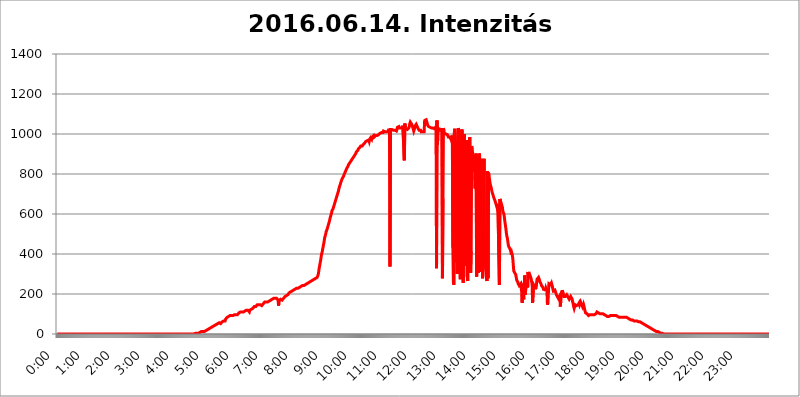
| Category | 2016.06.14. Intenzitás [W/m^2] |
|---|---|
| 0.0 | 0 |
| 0.0006944444444444445 | 0 |
| 0.001388888888888889 | 0 |
| 0.0020833333333333333 | 0 |
| 0.002777777777777778 | 0 |
| 0.003472222222222222 | 0 |
| 0.004166666666666667 | 0 |
| 0.004861111111111111 | 0 |
| 0.005555555555555556 | 0 |
| 0.0062499999999999995 | 0 |
| 0.006944444444444444 | 0 |
| 0.007638888888888889 | 0 |
| 0.008333333333333333 | 0 |
| 0.009027777777777779 | 0 |
| 0.009722222222222222 | 0 |
| 0.010416666666666666 | 0 |
| 0.011111111111111112 | 0 |
| 0.011805555555555555 | 0 |
| 0.012499999999999999 | 0 |
| 0.013194444444444444 | 0 |
| 0.013888888888888888 | 0 |
| 0.014583333333333332 | 0 |
| 0.015277777777777777 | 0 |
| 0.015972222222222224 | 0 |
| 0.016666666666666666 | 0 |
| 0.017361111111111112 | 0 |
| 0.018055555555555557 | 0 |
| 0.01875 | 0 |
| 0.019444444444444445 | 0 |
| 0.02013888888888889 | 0 |
| 0.020833333333333332 | 0 |
| 0.02152777777777778 | 0 |
| 0.022222222222222223 | 0 |
| 0.02291666666666667 | 0 |
| 0.02361111111111111 | 0 |
| 0.024305555555555556 | 0 |
| 0.024999999999999998 | 0 |
| 0.025694444444444447 | 0 |
| 0.02638888888888889 | 0 |
| 0.027083333333333334 | 0 |
| 0.027777777777777776 | 0 |
| 0.02847222222222222 | 0 |
| 0.029166666666666664 | 0 |
| 0.029861111111111113 | 0 |
| 0.030555555555555555 | 0 |
| 0.03125 | 0 |
| 0.03194444444444445 | 0 |
| 0.03263888888888889 | 0 |
| 0.03333333333333333 | 0 |
| 0.034027777777777775 | 0 |
| 0.034722222222222224 | 0 |
| 0.035416666666666666 | 0 |
| 0.036111111111111115 | 0 |
| 0.03680555555555556 | 0 |
| 0.0375 | 0 |
| 0.03819444444444444 | 0 |
| 0.03888888888888889 | 0 |
| 0.03958333333333333 | 0 |
| 0.04027777777777778 | 0 |
| 0.04097222222222222 | 0 |
| 0.041666666666666664 | 0 |
| 0.042361111111111106 | 0 |
| 0.04305555555555556 | 0 |
| 0.043750000000000004 | 0 |
| 0.044444444444444446 | 0 |
| 0.04513888888888889 | 0 |
| 0.04583333333333334 | 0 |
| 0.04652777777777778 | 0 |
| 0.04722222222222222 | 0 |
| 0.04791666666666666 | 0 |
| 0.04861111111111111 | 0 |
| 0.049305555555555554 | 0 |
| 0.049999999999999996 | 0 |
| 0.05069444444444445 | 0 |
| 0.051388888888888894 | 0 |
| 0.052083333333333336 | 0 |
| 0.05277777777777778 | 0 |
| 0.05347222222222222 | 0 |
| 0.05416666666666667 | 0 |
| 0.05486111111111111 | 0 |
| 0.05555555555555555 | 0 |
| 0.05625 | 0 |
| 0.05694444444444444 | 0 |
| 0.057638888888888885 | 0 |
| 0.05833333333333333 | 0 |
| 0.05902777777777778 | 0 |
| 0.059722222222222225 | 0 |
| 0.06041666666666667 | 0 |
| 0.061111111111111116 | 0 |
| 0.06180555555555556 | 0 |
| 0.0625 | 0 |
| 0.06319444444444444 | 0 |
| 0.06388888888888888 | 0 |
| 0.06458333333333334 | 0 |
| 0.06527777777777778 | 0 |
| 0.06597222222222222 | 0 |
| 0.06666666666666667 | 0 |
| 0.06736111111111111 | 0 |
| 0.06805555555555555 | 0 |
| 0.06874999999999999 | 0 |
| 0.06944444444444443 | 0 |
| 0.07013888888888889 | 0 |
| 0.07083333333333333 | 0 |
| 0.07152777777777779 | 0 |
| 0.07222222222222223 | 0 |
| 0.07291666666666667 | 0 |
| 0.07361111111111111 | 0 |
| 0.07430555555555556 | 0 |
| 0.075 | 0 |
| 0.07569444444444444 | 0 |
| 0.0763888888888889 | 0 |
| 0.07708333333333334 | 0 |
| 0.07777777777777778 | 0 |
| 0.07847222222222222 | 0 |
| 0.07916666666666666 | 0 |
| 0.0798611111111111 | 0 |
| 0.08055555555555556 | 0 |
| 0.08125 | 0 |
| 0.08194444444444444 | 0 |
| 0.08263888888888889 | 0 |
| 0.08333333333333333 | 0 |
| 0.08402777777777777 | 0 |
| 0.08472222222222221 | 0 |
| 0.08541666666666665 | 0 |
| 0.08611111111111112 | 0 |
| 0.08680555555555557 | 0 |
| 0.08750000000000001 | 0 |
| 0.08819444444444445 | 0 |
| 0.08888888888888889 | 0 |
| 0.08958333333333333 | 0 |
| 0.09027777777777778 | 0 |
| 0.09097222222222222 | 0 |
| 0.09166666666666667 | 0 |
| 0.09236111111111112 | 0 |
| 0.09305555555555556 | 0 |
| 0.09375 | 0 |
| 0.09444444444444444 | 0 |
| 0.09513888888888888 | 0 |
| 0.09583333333333333 | 0 |
| 0.09652777777777777 | 0 |
| 0.09722222222222222 | 0 |
| 0.09791666666666667 | 0 |
| 0.09861111111111111 | 0 |
| 0.09930555555555555 | 0 |
| 0.09999999999999999 | 0 |
| 0.10069444444444443 | 0 |
| 0.1013888888888889 | 0 |
| 0.10208333333333335 | 0 |
| 0.10277777777777779 | 0 |
| 0.10347222222222223 | 0 |
| 0.10416666666666667 | 0 |
| 0.10486111111111111 | 0 |
| 0.10555555555555556 | 0 |
| 0.10625 | 0 |
| 0.10694444444444444 | 0 |
| 0.1076388888888889 | 0 |
| 0.10833333333333334 | 0 |
| 0.10902777777777778 | 0 |
| 0.10972222222222222 | 0 |
| 0.1111111111111111 | 0 |
| 0.11180555555555556 | 0 |
| 0.11180555555555556 | 0 |
| 0.1125 | 0 |
| 0.11319444444444444 | 0 |
| 0.11388888888888889 | 0 |
| 0.11458333333333333 | 0 |
| 0.11527777777777777 | 0 |
| 0.11597222222222221 | 0 |
| 0.11666666666666665 | 0 |
| 0.1173611111111111 | 0 |
| 0.11805555555555557 | 0 |
| 0.11944444444444445 | 0 |
| 0.12013888888888889 | 0 |
| 0.12083333333333333 | 0 |
| 0.12152777777777778 | 0 |
| 0.12222222222222223 | 0 |
| 0.12291666666666667 | 0 |
| 0.12291666666666667 | 0 |
| 0.12361111111111112 | 0 |
| 0.12430555555555556 | 0 |
| 0.125 | 0 |
| 0.12569444444444444 | 0 |
| 0.12638888888888888 | 0 |
| 0.12708333333333333 | 0 |
| 0.16875 | 0 |
| 0.12847222222222224 | 0 |
| 0.12916666666666668 | 0 |
| 0.12986111111111112 | 0 |
| 0.13055555555555556 | 0 |
| 0.13125 | 0 |
| 0.13194444444444445 | 0 |
| 0.1326388888888889 | 0 |
| 0.13333333333333333 | 0 |
| 0.13402777777777777 | 0 |
| 0.13402777777777777 | 0 |
| 0.13472222222222222 | 0 |
| 0.13541666666666666 | 0 |
| 0.1361111111111111 | 0 |
| 0.13749999999999998 | 0 |
| 0.13819444444444443 | 0 |
| 0.1388888888888889 | 0 |
| 0.13958333333333334 | 0 |
| 0.14027777777777778 | 0 |
| 0.14097222222222222 | 0 |
| 0.14166666666666666 | 0 |
| 0.1423611111111111 | 0 |
| 0.14305555555555557 | 0 |
| 0.14375000000000002 | 0 |
| 0.14444444444444446 | 0 |
| 0.1451388888888889 | 0 |
| 0.1451388888888889 | 0 |
| 0.14652777777777778 | 0 |
| 0.14722222222222223 | 0 |
| 0.14791666666666667 | 0 |
| 0.1486111111111111 | 0 |
| 0.14930555555555555 | 0 |
| 0.15 | 0 |
| 0.15069444444444444 | 0 |
| 0.15138888888888888 | 0 |
| 0.15208333333333332 | 0 |
| 0.15277777777777776 | 0 |
| 0.15347222222222223 | 0 |
| 0.15416666666666667 | 0 |
| 0.15486111111111112 | 0 |
| 0.15555555555555556 | 0 |
| 0.15625 | 0 |
| 0.15694444444444444 | 0 |
| 0.15763888888888888 | 0 |
| 0.15833333333333333 | 0 |
| 0.15902777777777777 | 0 |
| 0.15972222222222224 | 0 |
| 0.16041666666666668 | 0 |
| 0.16111111111111112 | 0 |
| 0.16180555555555556 | 0 |
| 0.1625 | 0 |
| 0.16319444444444445 | 0 |
| 0.1638888888888889 | 0 |
| 0.16458333333333333 | 0 |
| 0.16527777777777777 | 0 |
| 0.16597222222222222 | 0 |
| 0.16666666666666666 | 0 |
| 0.1673611111111111 | 0 |
| 0.16805555555555554 | 0 |
| 0.16874999999999998 | 0 |
| 0.16944444444444443 | 0 |
| 0.17013888888888887 | 0 |
| 0.1708333333333333 | 0 |
| 0.17152777777777775 | 0 |
| 0.17222222222222225 | 0 |
| 0.1729166666666667 | 0 |
| 0.17361111111111113 | 0 |
| 0.17430555555555557 | 0 |
| 0.17500000000000002 | 0 |
| 0.17569444444444446 | 0 |
| 0.1763888888888889 | 0 |
| 0.17708333333333334 | 0 |
| 0.17777777777777778 | 0 |
| 0.17847222222222223 | 0 |
| 0.17916666666666667 | 0 |
| 0.1798611111111111 | 0 |
| 0.18055555555555555 | 0 |
| 0.18125 | 0 |
| 0.18194444444444444 | 0 |
| 0.1826388888888889 | 0 |
| 0.18333333333333335 | 0 |
| 0.1840277777777778 | 0 |
| 0.18472222222222223 | 0 |
| 0.18541666666666667 | 0 |
| 0.18611111111111112 | 0 |
| 0.18680555555555556 | 0 |
| 0.1875 | 0 |
| 0.18819444444444444 | 0 |
| 0.18888888888888888 | 0 |
| 0.18958333333333333 | 0 |
| 0.19027777777777777 | 0 |
| 0.1909722222222222 | 0 |
| 0.19166666666666665 | 0 |
| 0.19236111111111112 | 3.525 |
| 0.19305555555555554 | 3.525 |
| 0.19375 | 3.525 |
| 0.19444444444444445 | 3.525 |
| 0.1951388888888889 | 3.525 |
| 0.19583333333333333 | 3.525 |
| 0.19652777777777777 | 3.525 |
| 0.19722222222222222 | 3.525 |
| 0.19791666666666666 | 3.525 |
| 0.1986111111111111 | 7.887 |
| 0.19930555555555554 | 7.887 |
| 0.19999999999999998 | 7.887 |
| 0.20069444444444443 | 7.887 |
| 0.20138888888888887 | 7.887 |
| 0.2020833333333333 | 12.257 |
| 0.2027777777777778 | 12.257 |
| 0.2034722222222222 | 12.257 |
| 0.2041666666666667 | 12.257 |
| 0.20486111111111113 | 12.257 |
| 0.20555555555555557 | 12.257 |
| 0.20625000000000002 | 12.257 |
| 0.20694444444444446 | 16.636 |
| 0.2076388888888889 | 16.636 |
| 0.20833333333333334 | 16.636 |
| 0.20902777777777778 | 16.636 |
| 0.20972222222222223 | 21.024 |
| 0.21041666666666667 | 21.024 |
| 0.2111111111111111 | 21.024 |
| 0.21180555555555555 | 21.024 |
| 0.2125 | 25.419 |
| 0.21319444444444444 | 25.419 |
| 0.2138888888888889 | 25.419 |
| 0.21458333333333335 | 29.823 |
| 0.2152777777777778 | 29.823 |
| 0.21597222222222223 | 29.823 |
| 0.21666666666666667 | 34.234 |
| 0.21736111111111112 | 34.234 |
| 0.21805555555555556 | 38.653 |
| 0.21875 | 38.653 |
| 0.21944444444444444 | 38.653 |
| 0.22013888888888888 | 38.653 |
| 0.22083333333333333 | 43.079 |
| 0.22152777777777777 | 43.079 |
| 0.2222222222222222 | 47.511 |
| 0.22291666666666665 | 47.511 |
| 0.2236111111111111 | 47.511 |
| 0.22430555555555556 | 51.951 |
| 0.225 | 51.951 |
| 0.22569444444444445 | 51.951 |
| 0.2263888888888889 | 51.951 |
| 0.22708333333333333 | 56.398 |
| 0.22777777777777777 | 56.398 |
| 0.22847222222222222 | 51.951 |
| 0.22916666666666666 | 51.951 |
| 0.2298611111111111 | 51.951 |
| 0.23055555555555554 | 56.398 |
| 0.23124999999999998 | 60.85 |
| 0.23194444444444443 | 60.85 |
| 0.23263888888888887 | 60.85 |
| 0.2333333333333333 | 65.31 |
| 0.2340277777777778 | 65.31 |
| 0.2347222222222222 | 65.31 |
| 0.2354166666666667 | 65.31 |
| 0.23611111111111113 | 74.246 |
| 0.23680555555555557 | 74.246 |
| 0.23750000000000002 | 78.722 |
| 0.23819444444444446 | 83.205 |
| 0.2388888888888889 | 83.205 |
| 0.23958333333333334 | 83.205 |
| 0.24027777777777778 | 87.692 |
| 0.24097222222222223 | 87.692 |
| 0.24166666666666667 | 87.692 |
| 0.2423611111111111 | 92.184 |
| 0.24305555555555555 | 92.184 |
| 0.24375 | 92.184 |
| 0.24444444444444446 | 92.184 |
| 0.24513888888888888 | 96.682 |
| 0.24583333333333335 | 96.682 |
| 0.2465277777777778 | 92.184 |
| 0.24722222222222223 | 92.184 |
| 0.24791666666666667 | 96.682 |
| 0.24861111111111112 | 96.682 |
| 0.24930555555555556 | 101.184 |
| 0.25 | 101.184 |
| 0.25069444444444444 | 96.682 |
| 0.2513888888888889 | 92.184 |
| 0.2520833333333333 | 92.184 |
| 0.25277777777777777 | 96.682 |
| 0.2534722222222222 | 96.682 |
| 0.25416666666666665 | 101.184 |
| 0.2548611111111111 | 105.69 |
| 0.2555555555555556 | 110.201 |
| 0.25625000000000003 | 110.201 |
| 0.2569444444444445 | 110.201 |
| 0.2576388888888889 | 114.716 |
| 0.25833333333333336 | 110.201 |
| 0.2590277777777778 | 110.201 |
| 0.25972222222222224 | 110.201 |
| 0.2604166666666667 | 110.201 |
| 0.2611111111111111 | 110.201 |
| 0.26180555555555557 | 110.201 |
| 0.2625 | 114.716 |
| 0.26319444444444445 | 114.716 |
| 0.2638888888888889 | 114.716 |
| 0.26458333333333334 | 119.235 |
| 0.2652777777777778 | 119.235 |
| 0.2659722222222222 | 119.235 |
| 0.26666666666666666 | 123.758 |
| 0.2673611111111111 | 119.235 |
| 0.26805555555555555 | 119.235 |
| 0.26875 | 114.716 |
| 0.26944444444444443 | 110.201 |
| 0.2701388888888889 | 119.235 |
| 0.2708333333333333 | 123.758 |
| 0.27152777777777776 | 123.758 |
| 0.2722222222222222 | 123.758 |
| 0.27291666666666664 | 128.284 |
| 0.2736111111111111 | 123.758 |
| 0.2743055555555555 | 128.284 |
| 0.27499999999999997 | 132.814 |
| 0.27569444444444446 | 132.814 |
| 0.27638888888888885 | 137.347 |
| 0.27708333333333335 | 137.347 |
| 0.2777777777777778 | 137.347 |
| 0.27847222222222223 | 137.347 |
| 0.2791666666666667 | 141.884 |
| 0.2798611111111111 | 141.884 |
| 0.28055555555555556 | 146.423 |
| 0.28125 | 146.423 |
| 0.28194444444444444 | 146.423 |
| 0.2826388888888889 | 146.423 |
| 0.2833333333333333 | 146.423 |
| 0.28402777777777777 | 146.423 |
| 0.2847222222222222 | 146.423 |
| 0.28541666666666665 | 146.423 |
| 0.28611111111111115 | 146.423 |
| 0.28680555555555554 | 141.884 |
| 0.28750000000000003 | 146.423 |
| 0.2881944444444445 | 146.423 |
| 0.2888888888888889 | 150.964 |
| 0.28958333333333336 | 150.964 |
| 0.2902777777777778 | 155.509 |
| 0.29097222222222224 | 160.056 |
| 0.2916666666666667 | 155.509 |
| 0.2923611111111111 | 160.056 |
| 0.29305555555555557 | 160.056 |
| 0.29375 | 160.056 |
| 0.29444444444444445 | 160.056 |
| 0.2951388888888889 | 160.056 |
| 0.29583333333333334 | 164.605 |
| 0.2965277777777778 | 164.605 |
| 0.2972222222222222 | 164.605 |
| 0.29791666666666666 | 164.605 |
| 0.2986111111111111 | 169.156 |
| 0.29930555555555555 | 169.156 |
| 0.3 | 169.156 |
| 0.30069444444444443 | 173.709 |
| 0.3013888888888889 | 173.709 |
| 0.3020833333333333 | 173.709 |
| 0.30277777777777776 | 173.709 |
| 0.3034722222222222 | 178.264 |
| 0.30416666666666664 | 173.709 |
| 0.3048611111111111 | 178.264 |
| 0.3055555555555555 | 178.264 |
| 0.30624999999999997 | 178.264 |
| 0.3069444444444444 | 178.264 |
| 0.3076388888888889 | 178.264 |
| 0.30833333333333335 | 178.264 |
| 0.3090277777777778 | 173.709 |
| 0.30972222222222223 | 169.156 |
| 0.3104166666666667 | 141.884 |
| 0.3111111111111111 | 169.156 |
| 0.31180555555555556 | 169.156 |
| 0.3125 | 169.156 |
| 0.31319444444444444 | 173.709 |
| 0.3138888888888889 | 173.709 |
| 0.3145833333333333 | 169.156 |
| 0.31527777777777777 | 169.156 |
| 0.3159722222222222 | 173.709 |
| 0.31666666666666665 | 173.709 |
| 0.31736111111111115 | 178.264 |
| 0.31805555555555554 | 182.82 |
| 0.31875000000000003 | 182.82 |
| 0.3194444444444445 | 187.378 |
| 0.3201388888888889 | 187.378 |
| 0.32083333333333336 | 191.937 |
| 0.3215277777777778 | 191.937 |
| 0.32222222222222224 | 191.937 |
| 0.3229166666666667 | 196.497 |
| 0.3236111111111111 | 196.497 |
| 0.32430555555555557 | 201.058 |
| 0.325 | 205.62 |
| 0.32569444444444445 | 205.62 |
| 0.3263888888888889 | 210.182 |
| 0.32708333333333334 | 210.182 |
| 0.3277777777777778 | 210.182 |
| 0.3284722222222222 | 210.182 |
| 0.32916666666666666 | 214.746 |
| 0.3298611111111111 | 214.746 |
| 0.33055555555555555 | 214.746 |
| 0.33125 | 219.309 |
| 0.33194444444444443 | 219.309 |
| 0.3326388888888889 | 219.309 |
| 0.3333333333333333 | 223.873 |
| 0.3340277777777778 | 223.873 |
| 0.3347222222222222 | 223.873 |
| 0.3354166666666667 | 228.436 |
| 0.3361111111111111 | 228.436 |
| 0.3368055555555556 | 228.436 |
| 0.33749999999999997 | 228.436 |
| 0.33819444444444446 | 233 |
| 0.33888888888888885 | 233 |
| 0.33958333333333335 | 233 |
| 0.34027777777777773 | 233 |
| 0.34097222222222223 | 237.564 |
| 0.3416666666666666 | 237.564 |
| 0.3423611111111111 | 237.564 |
| 0.3430555555555555 | 242.127 |
| 0.34375 | 242.127 |
| 0.3444444444444445 | 242.127 |
| 0.3451388888888889 | 242.127 |
| 0.3458333333333334 | 242.127 |
| 0.34652777777777777 | 242.127 |
| 0.34722222222222227 | 246.689 |
| 0.34791666666666665 | 246.689 |
| 0.34861111111111115 | 251.251 |
| 0.34930555555555554 | 251.251 |
| 0.35000000000000003 | 251.251 |
| 0.3506944444444444 | 251.251 |
| 0.3513888888888889 | 251.251 |
| 0.3520833333333333 | 255.813 |
| 0.3527777777777778 | 255.813 |
| 0.3534722222222222 | 260.373 |
| 0.3541666666666667 | 260.373 |
| 0.3548611111111111 | 260.373 |
| 0.35555555555555557 | 260.373 |
| 0.35625 | 264.932 |
| 0.35694444444444445 | 264.932 |
| 0.3576388888888889 | 269.49 |
| 0.35833333333333334 | 269.49 |
| 0.3590277777777778 | 269.49 |
| 0.3597222222222222 | 269.49 |
| 0.36041666666666666 | 274.047 |
| 0.3611111111111111 | 274.047 |
| 0.36180555555555555 | 274.047 |
| 0.3625 | 278.603 |
| 0.36319444444444443 | 278.603 |
| 0.3638888888888889 | 278.603 |
| 0.3645833333333333 | 283.156 |
| 0.3652777777777778 | 287.709 |
| 0.3659722222222222 | 296.808 |
| 0.3666666666666667 | 310.44 |
| 0.3673611111111111 | 328.584 |
| 0.3680555555555556 | 342.162 |
| 0.36874999999999997 | 355.712 |
| 0.36944444444444446 | 369.23 |
| 0.37013888888888885 | 387.202 |
| 0.37083333333333335 | 400.638 |
| 0.37152777777777773 | 409.574 |
| 0.37222222222222223 | 422.943 |
| 0.3729166666666666 | 436.27 |
| 0.3736111111111111 | 449.551 |
| 0.3743055555555555 | 462.786 |
| 0.375 | 480.356 |
| 0.3756944444444445 | 489.108 |
| 0.3763888888888889 | 497.836 |
| 0.3770833333333334 | 510.885 |
| 0.37777777777777777 | 515.223 |
| 0.37847222222222227 | 523.88 |
| 0.37916666666666665 | 532.513 |
| 0.37986111111111115 | 541.121 |
| 0.38055555555555554 | 549.704 |
| 0.38125000000000003 | 558.261 |
| 0.3819444444444444 | 566.793 |
| 0.3826388888888889 | 579.542 |
| 0.3833333333333333 | 588.009 |
| 0.3840277777777778 | 596.45 |
| 0.3847222222222222 | 604.864 |
| 0.3854166666666667 | 617.436 |
| 0.3861111111111111 | 621.613 |
| 0.38680555555555557 | 625.784 |
| 0.3875 | 634.105 |
| 0.38819444444444445 | 642.4 |
| 0.3888888888888889 | 650.667 |
| 0.38958333333333334 | 658.909 |
| 0.3902777777777778 | 667.123 |
| 0.3909722222222222 | 675.311 |
| 0.39166666666666666 | 683.473 |
| 0.3923611111111111 | 691.608 |
| 0.39305555555555555 | 699.717 |
| 0.39375 | 707.8 |
| 0.39444444444444443 | 715.858 |
| 0.3951388888888889 | 727.896 |
| 0.3958333333333333 | 735.89 |
| 0.3965277777777778 | 743.859 |
| 0.3972222222222222 | 751.803 |
| 0.3979166666666667 | 759.723 |
| 0.3986111111111111 | 767.62 |
| 0.3993055555555556 | 771.559 |
| 0.39999999999999997 | 779.42 |
| 0.40069444444444446 | 783.342 |
| 0.40138888888888885 | 787.258 |
| 0.40208333333333335 | 795.074 |
| 0.40277777777777773 | 798.974 |
| 0.40347222222222223 | 806.757 |
| 0.4041666666666666 | 810.641 |
| 0.4048611111111111 | 818.392 |
| 0.4055555555555555 | 822.26 |
| 0.40625 | 829.981 |
| 0.4069444444444445 | 833.834 |
| 0.4076388888888889 | 837.682 |
| 0.4083333333333334 | 845.365 |
| 0.40902777777777777 | 845.365 |
| 0.40972222222222227 | 853.029 |
| 0.41041666666666665 | 856.855 |
| 0.41111111111111115 | 860.676 |
| 0.41180555555555554 | 860.676 |
| 0.41250000000000003 | 868.305 |
| 0.4131944444444444 | 868.305 |
| 0.4138888888888889 | 872.114 |
| 0.4145833333333333 | 879.719 |
| 0.4152777777777778 | 883.516 |
| 0.4159722222222222 | 887.309 |
| 0.4166666666666667 | 887.309 |
| 0.4173611111111111 | 894.885 |
| 0.41805555555555557 | 898.668 |
| 0.41875 | 902.447 |
| 0.41944444444444445 | 909.996 |
| 0.4201388888888889 | 909.996 |
| 0.42083333333333334 | 913.766 |
| 0.4215277777777778 | 917.534 |
| 0.4222222222222222 | 925.06 |
| 0.42291666666666666 | 925.06 |
| 0.4236111111111111 | 928.819 |
| 0.42430555555555555 | 932.576 |
| 0.425 | 936.33 |
| 0.42569444444444443 | 940.082 |
| 0.4263888888888889 | 936.33 |
| 0.4270833333333333 | 943.832 |
| 0.4277777777777778 | 940.082 |
| 0.4284722222222222 | 940.082 |
| 0.4291666666666667 | 947.58 |
| 0.4298611111111111 | 947.58 |
| 0.4305555555555556 | 951.327 |
| 0.43124999999999997 | 955.071 |
| 0.43194444444444446 | 958.814 |
| 0.43263888888888885 | 962.555 |
| 0.43333333333333335 | 962.555 |
| 0.43402777777777773 | 958.814 |
| 0.43472222222222223 | 966.295 |
| 0.4354166666666666 | 962.555 |
| 0.4361111111111111 | 962.555 |
| 0.4368055555555555 | 970.034 |
| 0.4375 | 962.555 |
| 0.4381944444444445 | 973.772 |
| 0.4388888888888889 | 970.034 |
| 0.4395833333333334 | 981.244 |
| 0.44027777777777777 | 984.98 |
| 0.44097222222222227 | 973.772 |
| 0.44166666666666665 | 984.98 |
| 0.44236111111111115 | 988.714 |
| 0.44305555555555554 | 984.98 |
| 0.44375000000000003 | 992.448 |
| 0.4444444444444444 | 984.98 |
| 0.4451388888888889 | 984.98 |
| 0.4458333333333333 | 984.98 |
| 0.4465277777777778 | 992.448 |
| 0.4472222222222222 | 996.182 |
| 0.4479166666666667 | 992.448 |
| 0.4486111111111111 | 992.448 |
| 0.44930555555555557 | 996.182 |
| 0.45 | 996.182 |
| 0.45069444444444445 | 996.182 |
| 0.4513888888888889 | 999.916 |
| 0.45208333333333334 | 999.916 |
| 0.4527777777777778 | 1003.65 |
| 0.4534722222222222 | 1003.65 |
| 0.45416666666666666 | 1007.383 |
| 0.4548611111111111 | 1007.383 |
| 0.45555555555555555 | 1011.118 |
| 0.45625 | 1011.118 |
| 0.45694444444444443 | 1007.383 |
| 0.4576388888888889 | 1014.852 |
| 0.4583333333333333 | 1014.852 |
| 0.4590277777777778 | 1014.852 |
| 0.4597222222222222 | 1011.118 |
| 0.4604166666666667 | 1011.118 |
| 0.4611111111111111 | 1011.118 |
| 0.4618055555555556 | 1011.118 |
| 0.46249999999999997 | 1011.118 |
| 0.46319444444444446 | 1007.383 |
| 0.46388888888888885 | 1011.118 |
| 0.46458333333333335 | 1014.852 |
| 0.46527777777777773 | 1026.06 |
| 0.46597222222222223 | 1003.65 |
| 0.4666666666666666 | 337.639 |
| 0.4673611111111111 | 1022.323 |
| 0.4680555555555555 | 1022.323 |
| 0.46875 | 1022.323 |
| 0.4694444444444445 | 1022.323 |
| 0.4701388888888889 | 1018.587 |
| 0.4708333333333334 | 1018.587 |
| 0.47152777777777777 | 1018.587 |
| 0.47222222222222227 | 1018.587 |
| 0.47291666666666665 | 1014.852 |
| 0.47361111111111115 | 1018.587 |
| 0.47430555555555554 | 1022.323 |
| 0.47500000000000003 | 1022.323 |
| 0.4756944444444444 | 1014.852 |
| 0.4763888888888889 | 1022.323 |
| 0.4770833333333333 | 1033.537 |
| 0.4777777777777778 | 1037.277 |
| 0.4784722222222222 | 1037.277 |
| 0.4791666666666667 | 1037.277 |
| 0.4798611111111111 | 1029.798 |
| 0.48055555555555557 | 1029.798 |
| 0.48125 | 1033.537 |
| 0.48194444444444445 | 1029.798 |
| 0.4826388888888889 | 1029.798 |
| 0.48333333333333334 | 1033.537 |
| 0.4840277777777778 | 1033.537 |
| 0.4847222222222222 | 1041.019 |
| 0.48541666666666666 | 1041.019 |
| 0.4861111111111111 | 1041.019 |
| 0.48680555555555555 | 868.305 |
| 0.4875 | 1052.255 |
| 0.48819444444444443 | 1033.537 |
| 0.4888888888888889 | 1026.06 |
| 0.4895833333333333 | 1026.06 |
| 0.4902777777777778 | 1026.06 |
| 0.4909722222222222 | 1022.323 |
| 0.4916666666666667 | 1022.323 |
| 0.4923611111111111 | 1022.323 |
| 0.4930555555555556 | 1029.798 |
| 0.49374999999999997 | 1037.277 |
| 0.49444444444444446 | 1052.255 |
| 0.49513888888888885 | 1059.756 |
| 0.49583333333333335 | 1056.004 |
| 0.49652777777777773 | 1056.004 |
| 0.49722222222222223 | 1048.508 |
| 0.4979166666666666 | 1041.019 |
| 0.4986111111111111 | 1033.537 |
| 0.4993055555555555 | 1029.798 |
| 0.5 | 1014.852 |
| 0.5006944444444444 | 1022.323 |
| 0.5013888888888889 | 1026.06 |
| 0.5020833333333333 | 1041.019 |
| 0.5027777777777778 | 1041.019 |
| 0.5034722222222222 | 1048.508 |
| 0.5041666666666667 | 1044.762 |
| 0.5048611111111111 | 1037.277 |
| 0.5055555555555555 | 1037.277 |
| 0.50625 | 1026.06 |
| 0.5069444444444444 | 1026.06 |
| 0.5076388888888889 | 1018.587 |
| 0.5083333333333333 | 1022.323 |
| 0.5090277777777777 | 1018.587 |
| 0.5097222222222222 | 1018.587 |
| 0.5104166666666666 | 1011.118 |
| 0.5111111111111112 | 1014.852 |
| 0.5118055555555555 | 1014.852 |
| 0.5125000000000001 | 1011.118 |
| 0.5131944444444444 | 1011.118 |
| 0.513888888888889 | 1011.118 |
| 0.5145833333333333 | 1011.118 |
| 0.5152777777777778 | 1067.267 |
| 0.5159722222222222 | 1067.267 |
| 0.5166666666666667 | 1063.51 |
| 0.517361111111111 | 1071.027 |
| 0.5180555555555556 | 1067.267 |
| 0.5187499999999999 | 1056.004 |
| 0.5194444444444445 | 1044.762 |
| 0.5201388888888888 | 1041.019 |
| 0.5208333333333334 | 1037.277 |
| 0.5215277777777778 | 1033.537 |
| 0.5222222222222223 | 1033.537 |
| 0.5229166666666667 | 1033.537 |
| 0.5236111111111111 | 1029.798 |
| 0.5243055555555556 | 1033.537 |
| 0.525 | 1029.798 |
| 0.5256944444444445 | 1026.06 |
| 0.5263888888888889 | 1026.06 |
| 0.5270833333333333 | 1029.798 |
| 0.5277777777777778 | 1026.06 |
| 0.5284722222222222 | 1026.06 |
| 0.5291666666666667 | 1026.06 |
| 0.5298611111111111 | 1026.06 |
| 0.5305555555555556 | 1022.323 |
| 0.53125 | 1037.277 |
| 0.5319444444444444 | 328.584 |
| 0.5326388888888889 | 1067.267 |
| 0.5333333333333333 | 947.58 |
| 0.5340277777777778 | 1029.798 |
| 0.5347222222222222 | 1029.798 |
| 0.5354166666666667 | 1026.06 |
| 0.5361111111111111 | 1022.323 |
| 0.5368055555555555 | 1018.587 |
| 0.5375 | 1018.587 |
| 0.5381944444444444 | 1018.587 |
| 0.5388888888888889 | 1022.323 |
| 0.5395833333333333 | 1029.798 |
| 0.5402777777777777 | 278.603 |
| 0.5409722222222222 | 679.395 |
| 0.5416666666666666 | 1029.798 |
| 0.5423611111111112 | 1014.852 |
| 0.5430555555555555 | 1003.65 |
| 0.5437500000000001 | 1003.65 |
| 0.5444444444444444 | 999.916 |
| 0.545138888888889 | 999.916 |
| 0.5458333333333333 | 999.916 |
| 0.5465277777777778 | 996.182 |
| 0.5472222222222222 | 996.182 |
| 0.5479166666666667 | 992.448 |
| 0.548611111111111 | 984.98 |
| 0.5493055555555556 | 984.98 |
| 0.5499999999999999 | 984.98 |
| 0.5506944444444445 | 984.98 |
| 0.5513888888888888 | 981.244 |
| 0.5520833333333334 | 973.772 |
| 0.5527777777777778 | 977.508 |
| 0.5534722222222223 | 973.772 |
| 0.5541666666666667 | 992.448 |
| 0.5548611111111111 | 431.833 |
| 0.5555555555555556 | 260.373 |
| 0.55625 | 246.689 |
| 0.5569444444444445 | 1007.383 |
| 0.5576388888888889 | 1026.06 |
| 0.5583333333333333 | 962.555 |
| 0.5590277777777778 | 940.082 |
| 0.5597222222222222 | 360.221 |
| 0.5604166666666667 | 440.702 |
| 0.5611111111111111 | 301.354 |
| 0.5618055555555556 | 301.354 |
| 0.5625 | 1029.798 |
| 0.5631944444444444 | 1011.118 |
| 0.5638888888888889 | 988.714 |
| 0.5645833333333333 | 992.448 |
| 0.5652777777777778 | 274.047 |
| 0.5659722222222222 | 868.305 |
| 0.5666666666666667 | 342.162 |
| 0.5673611111111111 | 1022.323 |
| 0.5680555555555555 | 1007.383 |
| 0.56875 | 287.709 |
| 0.5694444444444444 | 255.813 |
| 0.5701388888888889 | 255.813 |
| 0.5708333333333333 | 999.916 |
| 0.5715277777777777 | 342.162 |
| 0.5722222222222222 | 378.224 |
| 0.5729166666666666 | 822.26 |
| 0.5736111111111112 | 833.834 |
| 0.5743055555555555 | 970.034 |
| 0.5750000000000001 | 287.709 |
| 0.5756944444444444 | 264.932 |
| 0.576388888888889 | 951.327 |
| 0.5770833333333333 | 571.049 |
| 0.5777777777777778 | 382.715 |
| 0.5784722222222222 | 984.98 |
| 0.5791666666666667 | 333.113 |
| 0.579861111111111 | 305.898 |
| 0.5805555555555556 | 414.035 |
| 0.5812499999999999 | 940.082 |
| 0.5819444444444445 | 917.534 |
| 0.5826388888888888 | 906.223 |
| 0.5833333333333334 | 898.668 |
| 0.5840277777777778 | 891.099 |
| 0.5847222222222223 | 883.516 |
| 0.5854166666666667 | 883.516 |
| 0.5861111111111111 | 727.896 |
| 0.5868055555555556 | 868.305 |
| 0.5875 | 902.447 |
| 0.5881944444444445 | 287.709 |
| 0.5888888888888889 | 883.516 |
| 0.5895833333333333 | 887.309 |
| 0.5902777777777778 | 305.898 |
| 0.5909722222222222 | 360.221 |
| 0.5916666666666667 | 902.447 |
| 0.5923611111111111 | 894.885 |
| 0.5930555555555556 | 310.44 |
| 0.59375 | 364.728 |
| 0.5944444444444444 | 875.918 |
| 0.5951388888888889 | 369.23 |
| 0.5958333333333333 | 471.582 |
| 0.5965277777777778 | 278.603 |
| 0.5972222222222222 | 342.162 |
| 0.5979166666666667 | 532.513 |
| 0.5986111111111111 | 875.918 |
| 0.5993055555555555 | 387.202 |
| 0.6 | 333.113 |
| 0.6006944444444444 | 378.224 |
| 0.6013888888888889 | 319.517 |
| 0.6020833333333333 | 278.603 |
| 0.6027777777777777 | 264.932 |
| 0.6034722222222222 | 814.519 |
| 0.6041666666666666 | 278.603 |
| 0.6048611111111112 | 806.757 |
| 0.6055555555555555 | 791.169 |
| 0.6062500000000001 | 775.492 |
| 0.6069444444444444 | 755.766 |
| 0.607638888888889 | 743.859 |
| 0.6083333333333333 | 735.89 |
| 0.6090277777777778 | 723.889 |
| 0.6097222222222222 | 711.832 |
| 0.6104166666666667 | 703.762 |
| 0.611111111111111 | 695.666 |
| 0.6118055555555556 | 687.544 |
| 0.6124999999999999 | 679.395 |
| 0.6131944444444445 | 675.311 |
| 0.6138888888888888 | 667.123 |
| 0.6145833333333334 | 658.909 |
| 0.6152777777777778 | 650.667 |
| 0.6159722222222223 | 642.4 |
| 0.6166666666666667 | 634.105 |
| 0.6173611111111111 | 642.4 |
| 0.6180555555555556 | 650.667 |
| 0.61875 | 654.791 |
| 0.6194444444444445 | 650.667 |
| 0.6201388888888889 | 246.689 |
| 0.6208333333333333 | 675.311 |
| 0.6215277777777778 | 667.123 |
| 0.6222222222222222 | 658.909 |
| 0.6229166666666667 | 650.667 |
| 0.6236111111111111 | 646.537 |
| 0.6243055555555556 | 634.105 |
| 0.625 | 613.252 |
| 0.6256944444444444 | 609.062 |
| 0.6263888888888889 | 600.661 |
| 0.6270833333333333 | 583.779 |
| 0.6277777777777778 | 562.53 |
| 0.6284722222222222 | 545.416 |
| 0.6291666666666667 | 528.2 |
| 0.6298611111111111 | 506.542 |
| 0.6305555555555555 | 489.108 |
| 0.63125 | 480.356 |
| 0.6319444444444444 | 462.786 |
| 0.6326388888888889 | 445.129 |
| 0.6333333333333333 | 436.27 |
| 0.6340277777777777 | 431.833 |
| 0.6347222222222222 | 427.39 |
| 0.6354166666666666 | 422.943 |
| 0.6361111111111112 | 414.035 |
| 0.6368055555555555 | 396.164 |
| 0.6375000000000001 | 405.108 |
| 0.6381944444444444 | 396.164 |
| 0.638888888888889 | 378.224 |
| 0.6395833333333333 | 346.682 |
| 0.6402777777777778 | 314.98 |
| 0.6409722222222222 | 310.44 |
| 0.6416666666666667 | 305.898 |
| 0.642361111111111 | 305.898 |
| 0.6430555555555556 | 296.808 |
| 0.6437499999999999 | 283.156 |
| 0.6444444444444445 | 269.49 |
| 0.6451388888888888 | 264.932 |
| 0.6458333333333334 | 260.373 |
| 0.6465277777777778 | 251.251 |
| 0.6472222222222223 | 246.689 |
| 0.6479166666666667 | 242.127 |
| 0.6486111111111111 | 246.689 |
| 0.6493055555555556 | 246.689 |
| 0.65 | 251.251 |
| 0.6506944444444445 | 255.813 |
| 0.6513888888888889 | 210.182 |
| 0.6520833333333333 | 155.509 |
| 0.6527777777777778 | 251.251 |
| 0.6534722222222222 | 251.251 |
| 0.6541666666666667 | 173.709 |
| 0.6548611111111111 | 173.709 |
| 0.6555555555555556 | 292.259 |
| 0.65625 | 196.497 |
| 0.6569444444444444 | 219.309 |
| 0.6576388888888889 | 233 |
| 0.6583333333333333 | 237.564 |
| 0.6590277777777778 | 242.127 |
| 0.6597222222222222 | 233 |
| 0.6604166666666667 | 310.44 |
| 0.6611111111111111 | 296.808 |
| 0.6618055555555555 | 278.603 |
| 0.6625 | 283.156 |
| 0.6631944444444444 | 292.259 |
| 0.6638888888888889 | 287.709 |
| 0.6645833333333333 | 278.603 |
| 0.6652777777777777 | 260.373 |
| 0.6659722222222222 | 251.251 |
| 0.6666666666666666 | 155.509 |
| 0.6673611111111111 | 155.509 |
| 0.6680555555555556 | 246.689 |
| 0.6687500000000001 | 251.251 |
| 0.6694444444444444 | 246.689 |
| 0.6701388888888888 | 233 |
| 0.6708333333333334 | 223.873 |
| 0.6715277777777778 | 228.436 |
| 0.6722222222222222 | 251.251 |
| 0.6729166666666666 | 274.047 |
| 0.6736111111111112 | 278.603 |
| 0.6743055555555556 | 278.603 |
| 0.6749999999999999 | 283.156 |
| 0.6756944444444444 | 278.603 |
| 0.6763888888888889 | 269.49 |
| 0.6770833333333334 | 260.373 |
| 0.6777777777777777 | 255.813 |
| 0.6784722222222223 | 251.251 |
| 0.6791666666666667 | 242.127 |
| 0.6798611111111111 | 237.564 |
| 0.6805555555555555 | 237.564 |
| 0.68125 | 233 |
| 0.6819444444444445 | 223.873 |
| 0.6826388888888889 | 223.873 |
| 0.6833333333333332 | 223.873 |
| 0.6840277777777778 | 223.873 |
| 0.6847222222222222 | 214.746 |
| 0.6854166666666667 | 228.436 |
| 0.686111111111111 | 228.436 |
| 0.6868055555555556 | 214.746 |
| 0.6875 | 146.423 |
| 0.6881944444444444 | 155.509 |
| 0.688888888888889 | 210.182 |
| 0.6895833333333333 | 251.251 |
| 0.6902777777777778 | 251.251 |
| 0.6909722222222222 | 246.689 |
| 0.6916666666666668 | 246.689 |
| 0.6923611111111111 | 251.251 |
| 0.6930555555555555 | 255.813 |
| 0.69375 | 246.689 |
| 0.6944444444444445 | 237.564 |
| 0.6951388888888889 | 223.873 |
| 0.6958333333333333 | 214.746 |
| 0.6965277777777777 | 210.182 |
| 0.6972222222222223 | 210.182 |
| 0.6979166666666666 | 219.309 |
| 0.6986111111111111 | 214.746 |
| 0.6993055555555556 | 205.62 |
| 0.7000000000000001 | 196.497 |
| 0.7006944444444444 | 191.937 |
| 0.7013888888888888 | 187.378 |
| 0.7020833333333334 | 182.82 |
| 0.7027777777777778 | 178.264 |
| 0.7034722222222222 | 173.709 |
| 0.7041666666666666 | 182.82 |
| 0.7048611111111112 | 191.937 |
| 0.7055555555555556 | 137.347 |
| 0.7062499999999999 | 164.605 |
| 0.7069444444444444 | 196.497 |
| 0.7076388888888889 | 205.62 |
| 0.7083333333333334 | 219.309 |
| 0.7090277777777777 | 223.873 |
| 0.7097222222222223 | 219.309 |
| 0.7104166666666667 | 187.378 |
| 0.7111111111111111 | 191.937 |
| 0.7118055555555555 | 187.378 |
| 0.7125 | 187.378 |
| 0.7131944444444445 | 187.378 |
| 0.7138888888888889 | 191.937 |
| 0.7145833333333332 | 196.497 |
| 0.7152777777777778 | 196.497 |
| 0.7159722222222222 | 191.937 |
| 0.7166666666666667 | 182.82 |
| 0.717361111111111 | 182.82 |
| 0.7180555555555556 | 173.709 |
| 0.71875 | 173.709 |
| 0.7194444444444444 | 178.264 |
| 0.720138888888889 | 187.378 |
| 0.7208333333333333 | 187.378 |
| 0.7215277777777778 | 182.82 |
| 0.7222222222222222 | 173.709 |
| 0.7229166666666668 | 160.056 |
| 0.7236111111111111 | 150.964 |
| 0.7243055555555555 | 137.347 |
| 0.725 | 128.284 |
| 0.7256944444444445 | 128.284 |
| 0.7263888888888889 | 146.423 |
| 0.7270833333333333 | 141.884 |
| 0.7277777777777777 | 146.423 |
| 0.7284722222222223 | 141.884 |
| 0.7291666666666666 | 146.423 |
| 0.7298611111111111 | 141.884 |
| 0.7305555555555556 | 146.423 |
| 0.7312500000000001 | 150.964 |
| 0.7319444444444444 | 155.509 |
| 0.7326388888888888 | 146.423 |
| 0.7333333333333334 | 150.964 |
| 0.7340277777777778 | 160.056 |
| 0.7347222222222222 | 160.056 |
| 0.7354166666666666 | 155.509 |
| 0.7361111111111112 | 141.884 |
| 0.7368055555555556 | 155.509 |
| 0.7374999999999999 | 137.347 |
| 0.7381944444444444 | 146.423 |
| 0.7388888888888889 | 137.347 |
| 0.7395833333333334 | 123.758 |
| 0.7402777777777777 | 114.716 |
| 0.7409722222222223 | 105.69 |
| 0.7416666666666667 | 110.201 |
| 0.7423611111111111 | 110.201 |
| 0.7430555555555555 | 101.184 |
| 0.74375 | 96.682 |
| 0.7444444444444445 | 96.682 |
| 0.7451388888888889 | 92.184 |
| 0.7458333333333332 | 92.184 |
| 0.7465277777777778 | 92.184 |
| 0.7472222222222222 | 96.682 |
| 0.7479166666666667 | 96.682 |
| 0.748611111111111 | 96.682 |
| 0.7493055555555556 | 96.682 |
| 0.75 | 96.682 |
| 0.7506944444444444 | 92.184 |
| 0.751388888888889 | 96.682 |
| 0.7520833333333333 | 96.682 |
| 0.7527777777777778 | 96.682 |
| 0.7534722222222222 | 96.682 |
| 0.7541666666666668 | 96.682 |
| 0.7548611111111111 | 96.682 |
| 0.7555555555555555 | 101.184 |
| 0.75625 | 105.69 |
| 0.7569444444444445 | 110.201 |
| 0.7576388888888889 | 105.69 |
| 0.7583333333333333 | 105.69 |
| 0.7590277777777777 | 105.69 |
| 0.7597222222222223 | 101.184 |
| 0.7604166666666666 | 101.184 |
| 0.7611111111111111 | 101.184 |
| 0.7618055555555556 | 96.682 |
| 0.7625000000000001 | 101.184 |
| 0.7631944444444444 | 101.184 |
| 0.7638888888888888 | 96.682 |
| 0.7645833333333334 | 96.682 |
| 0.7652777777777778 | 101.184 |
| 0.7659722222222222 | 96.682 |
| 0.7666666666666666 | 96.682 |
| 0.7673611111111112 | 96.682 |
| 0.7680555555555556 | 92.184 |
| 0.7687499999999999 | 92.184 |
| 0.7694444444444444 | 92.184 |
| 0.7701388888888889 | 92.184 |
| 0.7708333333333334 | 87.692 |
| 0.7715277777777777 | 87.692 |
| 0.7722222222222223 | 87.692 |
| 0.7729166666666667 | 87.692 |
| 0.7736111111111111 | 87.692 |
| 0.7743055555555555 | 92.184 |
| 0.775 | 92.184 |
| 0.7756944444444445 | 92.184 |
| 0.7763888888888889 | 92.184 |
| 0.7770833333333332 | 92.184 |
| 0.7777777777777778 | 92.184 |
| 0.7784722222222222 | 92.184 |
| 0.7791666666666667 | 92.184 |
| 0.779861111111111 | 92.184 |
| 0.7805555555555556 | 92.184 |
| 0.78125 | 92.184 |
| 0.7819444444444444 | 92.184 |
| 0.782638888888889 | 92.184 |
| 0.7833333333333333 | 92.184 |
| 0.7840277777777778 | 92.184 |
| 0.7847222222222222 | 87.692 |
| 0.7854166666666668 | 87.692 |
| 0.7861111111111111 | 87.692 |
| 0.7868055555555555 | 83.205 |
| 0.7875 | 83.205 |
| 0.7881944444444445 | 83.205 |
| 0.7888888888888889 | 83.205 |
| 0.7895833333333333 | 83.205 |
| 0.7902777777777777 | 83.205 |
| 0.7909722222222223 | 83.205 |
| 0.7916666666666666 | 83.205 |
| 0.7923611111111111 | 83.205 |
| 0.7930555555555556 | 83.205 |
| 0.7937500000000001 | 83.205 |
| 0.7944444444444444 | 83.205 |
| 0.7951388888888888 | 83.205 |
| 0.7958333333333334 | 83.205 |
| 0.7965277777777778 | 83.205 |
| 0.7972222222222222 | 83.205 |
| 0.7979166666666666 | 83.205 |
| 0.7986111111111112 | 83.205 |
| 0.7993055555555556 | 78.722 |
| 0.7999999999999999 | 78.722 |
| 0.8006944444444444 | 78.722 |
| 0.8013888888888889 | 78.722 |
| 0.8020833333333334 | 74.246 |
| 0.8027777777777777 | 74.246 |
| 0.8034722222222223 | 74.246 |
| 0.8041666666666667 | 74.246 |
| 0.8048611111111111 | 69.775 |
| 0.8055555555555555 | 69.775 |
| 0.80625 | 69.775 |
| 0.8069444444444445 | 69.775 |
| 0.8076388888888889 | 69.775 |
| 0.8083333333333332 | 65.31 |
| 0.8090277777777778 | 65.31 |
| 0.8097222222222222 | 65.31 |
| 0.8104166666666667 | 65.31 |
| 0.811111111111111 | 65.31 |
| 0.8118055555555556 | 65.31 |
| 0.8125 | 65.31 |
| 0.8131944444444444 | 65.31 |
| 0.813888888888889 | 65.31 |
| 0.8145833333333333 | 60.85 |
| 0.8152777777777778 | 60.85 |
| 0.8159722222222222 | 60.85 |
| 0.8166666666666668 | 60.85 |
| 0.8173611111111111 | 60.85 |
| 0.8180555555555555 | 56.398 |
| 0.81875 | 56.398 |
| 0.8194444444444445 | 56.398 |
| 0.8201388888888889 | 56.398 |
| 0.8208333333333333 | 51.951 |
| 0.8215277777777777 | 51.951 |
| 0.8222222222222223 | 51.951 |
| 0.8229166666666666 | 47.511 |
| 0.8236111111111111 | 47.511 |
| 0.8243055555555556 | 47.511 |
| 0.8250000000000001 | 43.079 |
| 0.8256944444444444 | 43.079 |
| 0.8263888888888888 | 38.653 |
| 0.8270833333333334 | 38.653 |
| 0.8277777777777778 | 38.653 |
| 0.8284722222222222 | 38.653 |
| 0.8291666666666666 | 34.234 |
| 0.8298611111111112 | 34.234 |
| 0.8305555555555556 | 29.823 |
| 0.8312499999999999 | 29.823 |
| 0.8319444444444444 | 29.823 |
| 0.8326388888888889 | 25.419 |
| 0.8333333333333334 | 25.419 |
| 0.8340277777777777 | 25.419 |
| 0.8347222222222223 | 25.419 |
| 0.8354166666666667 | 21.024 |
| 0.8361111111111111 | 21.024 |
| 0.8368055555555555 | 21.024 |
| 0.8375 | 16.636 |
| 0.8381944444444445 | 16.636 |
| 0.8388888888888889 | 16.636 |
| 0.8395833333333332 | 16.636 |
| 0.8402777777777778 | 12.257 |
| 0.8409722222222222 | 12.257 |
| 0.8416666666666667 | 12.257 |
| 0.842361111111111 | 12.257 |
| 0.8430555555555556 | 12.257 |
| 0.84375 | 7.887 |
| 0.8444444444444444 | 7.887 |
| 0.845138888888889 | 7.887 |
| 0.8458333333333333 | 7.887 |
| 0.8465277777777778 | 3.525 |
| 0.8472222222222222 | 3.525 |
| 0.8479166666666668 | 3.525 |
| 0.8486111111111111 | 3.525 |
| 0.8493055555555555 | 3.525 |
| 0.85 | 0 |
| 0.8506944444444445 | 0 |
| 0.8513888888888889 | 0 |
| 0.8520833333333333 | 0 |
| 0.8527777777777777 | 0 |
| 0.8534722222222223 | 0 |
| 0.8541666666666666 | 0 |
| 0.8548611111111111 | 0 |
| 0.8555555555555556 | 0 |
| 0.8562500000000001 | 0 |
| 0.8569444444444444 | 0 |
| 0.8576388888888888 | 0 |
| 0.8583333333333334 | 0 |
| 0.8590277777777778 | 0 |
| 0.8597222222222222 | 0 |
| 0.8604166666666666 | 0 |
| 0.8611111111111112 | 0 |
| 0.8618055555555556 | 0 |
| 0.8624999999999999 | 0 |
| 0.8631944444444444 | 0 |
| 0.8638888888888889 | 0 |
| 0.8645833333333334 | 0 |
| 0.8652777777777777 | 0 |
| 0.8659722222222223 | 0 |
| 0.8666666666666667 | 0 |
| 0.8673611111111111 | 0 |
| 0.8680555555555555 | 0 |
| 0.86875 | 0 |
| 0.8694444444444445 | 0 |
| 0.8701388888888889 | 0 |
| 0.8708333333333332 | 0 |
| 0.8715277777777778 | 0 |
| 0.8722222222222222 | 0 |
| 0.8729166666666667 | 0 |
| 0.873611111111111 | 0 |
| 0.8743055555555556 | 0 |
| 0.875 | 0 |
| 0.8756944444444444 | 0 |
| 0.876388888888889 | 0 |
| 0.8770833333333333 | 0 |
| 0.8777777777777778 | 0 |
| 0.8784722222222222 | 0 |
| 0.8791666666666668 | 0 |
| 0.8798611111111111 | 0 |
| 0.8805555555555555 | 0 |
| 0.88125 | 0 |
| 0.8819444444444445 | 0 |
| 0.8826388888888889 | 0 |
| 0.8833333333333333 | 0 |
| 0.8840277777777777 | 0 |
| 0.8847222222222223 | 0 |
| 0.8854166666666666 | 0 |
| 0.8861111111111111 | 0 |
| 0.8868055555555556 | 0 |
| 0.8875000000000001 | 0 |
| 0.8881944444444444 | 0 |
| 0.8888888888888888 | 0 |
| 0.8895833333333334 | 0 |
| 0.8902777777777778 | 0 |
| 0.8909722222222222 | 0 |
| 0.8916666666666666 | 0 |
| 0.8923611111111112 | 0 |
| 0.8930555555555556 | 0 |
| 0.8937499999999999 | 0 |
| 0.8944444444444444 | 0 |
| 0.8951388888888889 | 0 |
| 0.8958333333333334 | 0 |
| 0.8965277777777777 | 0 |
| 0.8972222222222223 | 0 |
| 0.8979166666666667 | 0 |
| 0.8986111111111111 | 0 |
| 0.8993055555555555 | 0 |
| 0.9 | 0 |
| 0.9006944444444445 | 0 |
| 0.9013888888888889 | 0 |
| 0.9020833333333332 | 0 |
| 0.9027777777777778 | 0 |
| 0.9034722222222222 | 0 |
| 0.9041666666666667 | 0 |
| 0.904861111111111 | 0 |
| 0.9055555555555556 | 0 |
| 0.90625 | 0 |
| 0.9069444444444444 | 0 |
| 0.907638888888889 | 0 |
| 0.9083333333333333 | 0 |
| 0.9090277777777778 | 0 |
| 0.9097222222222222 | 0 |
| 0.9104166666666668 | 0 |
| 0.9111111111111111 | 0 |
| 0.9118055555555555 | 0 |
| 0.9125 | 0 |
| 0.9131944444444445 | 0 |
| 0.9138888888888889 | 0 |
| 0.9145833333333333 | 0 |
| 0.9152777777777777 | 0 |
| 0.9159722222222223 | 0 |
| 0.9166666666666666 | 0 |
| 0.9173611111111111 | 0 |
| 0.9180555555555556 | 0 |
| 0.9187500000000001 | 0 |
| 0.9194444444444444 | 0 |
| 0.9201388888888888 | 0 |
| 0.9208333333333334 | 0 |
| 0.9215277777777778 | 0 |
| 0.9222222222222222 | 0 |
| 0.9229166666666666 | 0 |
| 0.9236111111111112 | 0 |
| 0.9243055555555556 | 0 |
| 0.9249999999999999 | 0 |
| 0.9256944444444444 | 0 |
| 0.9263888888888889 | 0 |
| 0.9270833333333334 | 0 |
| 0.9277777777777777 | 0 |
| 0.9284722222222223 | 0 |
| 0.9291666666666667 | 0 |
| 0.9298611111111111 | 0 |
| 0.9305555555555555 | 0 |
| 0.93125 | 0 |
| 0.9319444444444445 | 0 |
| 0.9326388888888889 | 0 |
| 0.9333333333333332 | 0 |
| 0.9340277777777778 | 0 |
| 0.9347222222222222 | 0 |
| 0.9354166666666667 | 0 |
| 0.936111111111111 | 0 |
| 0.9368055555555556 | 0 |
| 0.9375 | 0 |
| 0.9381944444444444 | 0 |
| 0.938888888888889 | 0 |
| 0.9395833333333333 | 0 |
| 0.9402777777777778 | 0 |
| 0.9409722222222222 | 0 |
| 0.9416666666666668 | 0 |
| 0.9423611111111111 | 0 |
| 0.9430555555555555 | 0 |
| 0.94375 | 0 |
| 0.9444444444444445 | 0 |
| 0.9451388888888889 | 0 |
| 0.9458333333333333 | 0 |
| 0.9465277777777777 | 0 |
| 0.9472222222222223 | 0 |
| 0.9479166666666666 | 0 |
| 0.9486111111111111 | 0 |
| 0.9493055555555556 | 0 |
| 0.9500000000000001 | 0 |
| 0.9506944444444444 | 0 |
| 0.9513888888888888 | 0 |
| 0.9520833333333334 | 0 |
| 0.9527777777777778 | 0 |
| 0.9534722222222222 | 0 |
| 0.9541666666666666 | 0 |
| 0.9548611111111112 | 0 |
| 0.9555555555555556 | 0 |
| 0.9562499999999999 | 0 |
| 0.9569444444444444 | 0 |
| 0.9576388888888889 | 0 |
| 0.9583333333333334 | 0 |
| 0.9590277777777777 | 0 |
| 0.9597222222222223 | 0 |
| 0.9604166666666667 | 0 |
| 0.9611111111111111 | 0 |
| 0.9618055555555555 | 0 |
| 0.9625 | 0 |
| 0.9631944444444445 | 0 |
| 0.9638888888888889 | 0 |
| 0.9645833333333332 | 0 |
| 0.9652777777777778 | 0 |
| 0.9659722222222222 | 0 |
| 0.9666666666666667 | 0 |
| 0.967361111111111 | 0 |
| 0.9680555555555556 | 0 |
| 0.96875 | 0 |
| 0.9694444444444444 | 0 |
| 0.970138888888889 | 0 |
| 0.9708333333333333 | 0 |
| 0.9715277777777778 | 0 |
| 0.9722222222222222 | 0 |
| 0.9729166666666668 | 0 |
| 0.9736111111111111 | 0 |
| 0.9743055555555555 | 0 |
| 0.975 | 0 |
| 0.9756944444444445 | 0 |
| 0.9763888888888889 | 0 |
| 0.9770833333333333 | 0 |
| 0.9777777777777777 | 0 |
| 0.9784722222222223 | 0 |
| 0.9791666666666666 | 0 |
| 0.9798611111111111 | 0 |
| 0.9805555555555556 | 0 |
| 0.9812500000000001 | 0 |
| 0.9819444444444444 | 0 |
| 0.9826388888888888 | 0 |
| 0.9833333333333334 | 0 |
| 0.9840277777777778 | 0 |
| 0.9847222222222222 | 0 |
| 0.9854166666666666 | 0 |
| 0.9861111111111112 | 0 |
| 0.9868055555555556 | 0 |
| 0.9874999999999999 | 0 |
| 0.9881944444444444 | 0 |
| 0.9888888888888889 | 0 |
| 0.9895833333333334 | 0 |
| 0.9902777777777777 | 0 |
| 0.9909722222222223 | 0 |
| 0.9916666666666667 | 0 |
| 0.9923611111111111 | 0 |
| 0.9930555555555555 | 0 |
| 0.99375 | 0 |
| 0.9944444444444445 | 0 |
| 0.9951388888888889 | 0 |
| 0.9958333333333332 | 0 |
| 0.9965277777777778 | 0 |
| 0.9972222222222222 | 0 |
| 0.9979166666666667 | 0 |
| 0.998611111111111 | 0 |
| 0.9993055555555556 | 0 |